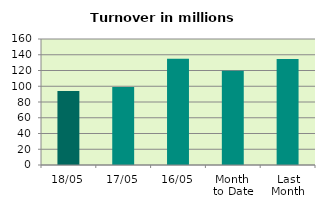
| Category | Series 0 |
|---|---|
| 18/05 | 94.008 |
| 17/05 | 99.174 |
| 16/05 | 134.858 |
| Month 
to Date | 119.651 |
| Last
Month | 134.694 |